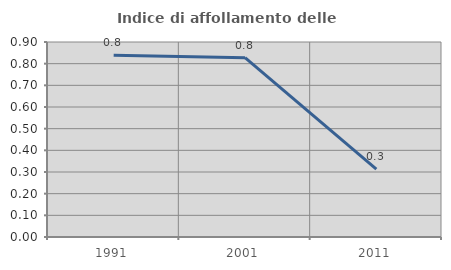
| Category | Indice di affollamento delle abitazioni  |
|---|---|
| 1991.0 | 0.839 |
| 2001.0 | 0.828 |
| 2011.0 | 0.313 |